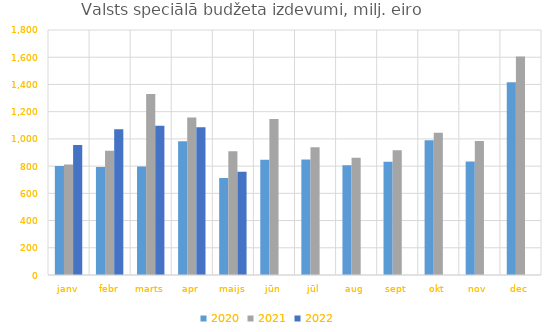
| Category | 2020 | 2021 | 2022 |
|---|---|---|---|
| janv | 800513.176 | 812540.784 | 954604.585 |
| febr | 793560.967 | 913452.191 | 1070533.109 |
| marts | 796946.618 | 1329058.335 | 1096177.665 |
| apr | 981781.839 | 1156902.965 | 1085060.388 |
| maijs | 711775.073 | 909621.75 | 759189.075 |
| jūn | 846260.327 | 1146703.878 | 0 |
| jūl | 848728.248 | 939467.851 | 0 |
| aug | 805848.679 | 860719.856 | 0 |
| sept | 832590.985 | 915890.517 | 0 |
| okt | 990572.907 | 1045656.477 | 0 |
| nov | 834311.145 | 984919.983 | 0 |
| dec | 1416800.012 | 1605011.589 | 0 |